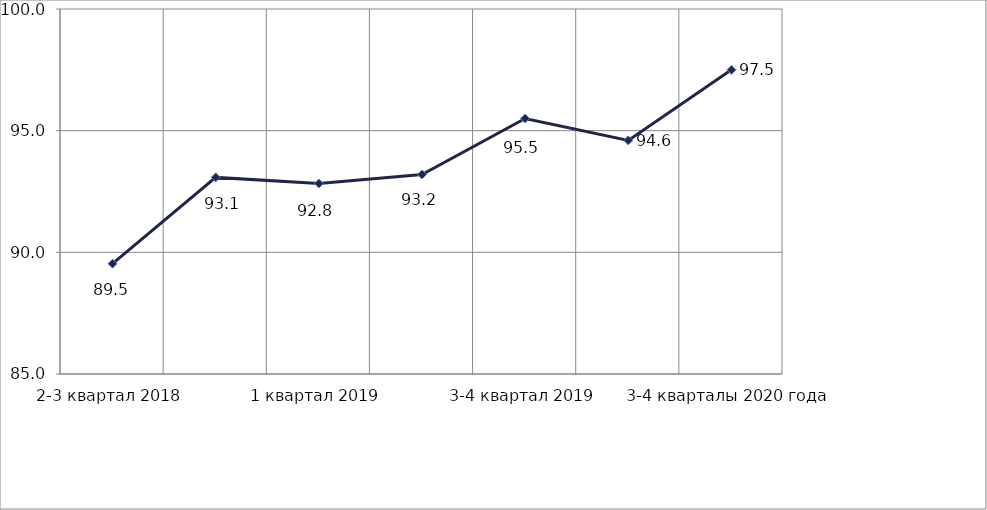
| Category | Series 0 |
|---|---|
| 2-3 квартал 2018 | 89.534 |
| 4 квартал 2018 | 93.08 |
| 1 квартал 2019 | 92.828 |
| 2 квартал 2019 | 93.2 |
| 3-4 квартал 2019 | 95.5 |
| 1-2 кварталы 2020 года | 94.6 |
| 3-4 кварталы 2020 года | 97.5 |